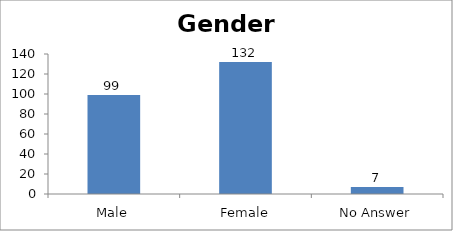
| Category | Gender |
|---|---|
| Male | 99 |
| Female | 132 |
| No Answer | 7 |